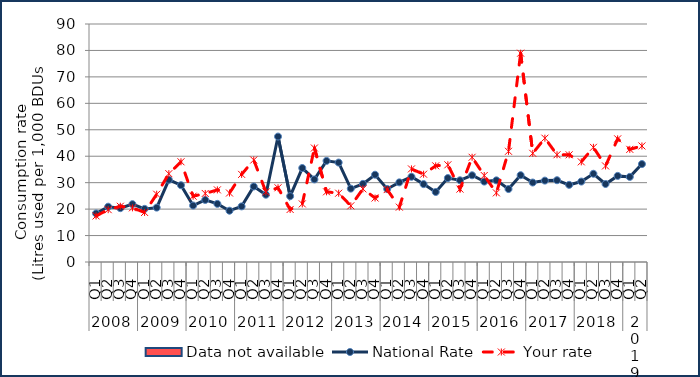
| Category | Data not available |
|---|---|
| 0 | 0 |
| 1 | 0 |
| 2 | 0 |
| 3 | 0 |
| 4 | 0 |
| 5 | 0 |
| 6 | 0 |
| 7 | 0 |
| 8 | 0 |
| 9 | 0 |
| 10 | 0 |
| 11 | 0 |
| 12 | 0 |
| 13 | 0 |
| 14 | 0 |
| 15 | 0 |
| 16 | 0 |
| 17 | 0 |
| 18 | 0 |
| 19 | 0 |
| 20 | 0 |
| 21 | 0 |
| 22 | 0 |
| 23 | 0 |
| 24 | 0 |
| 25 | 0 |
| 26 | 0 |
| 27 | 0 |
| 28 | 0 |
| 29 | 0 |
| 30 | 0 |
| 31 | 0 |
| 32 | 0 |
| 33 | 0 |
| 34 | 0 |
| 35 | 0 |
| 36 | 0 |
| 37 | 0 |
| 38 | 0 |
| 39 | 0 |
| 40 | 0 |
| 41 | 0 |
| 42 | 0 |
| 43 | 0 |
| 44 | 0 |
| 45 | 0 |